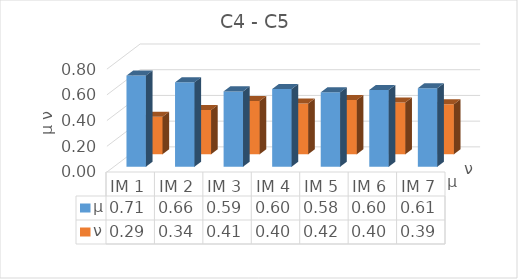
| Category | μ | ν |
|---|---|---|
| IM 1 | 0.709 | 0.291 |
| IM 2 | 0.657 | 0.343 |
| IM 3 | 0.586 | 0.414 |
| IM 4 | 0.605 | 0.395 |
| IM 5 | 0.579 | 0.421 |
| IM 6 | 0.598 | 0.402 |
| IM 7 | 0.612 | 0.388 |